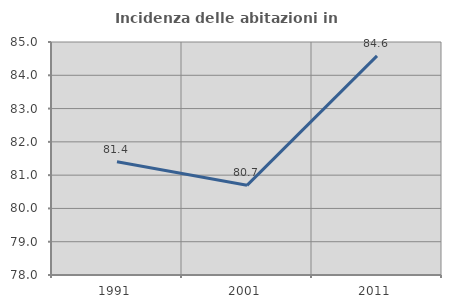
| Category | Incidenza delle abitazioni in proprietà  |
|---|---|
| 1991.0 | 81.404 |
| 2001.0 | 80.694 |
| 2011.0 | 84.585 |